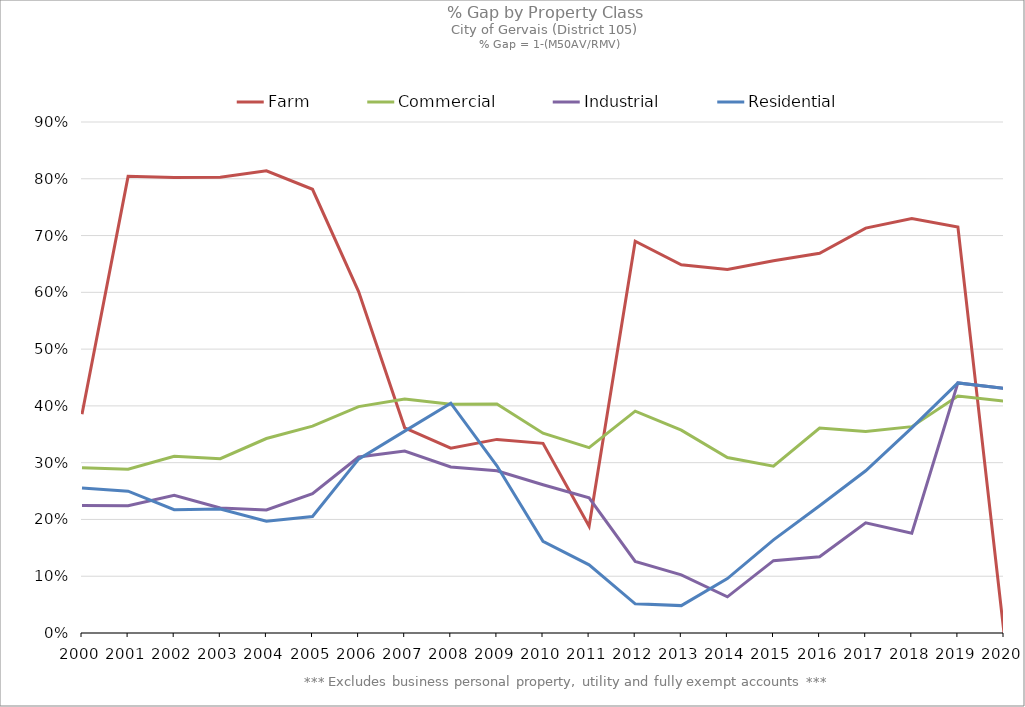
| Category | Farm | Commercial | Industrial | Residential |
|---|---|---|---|---|
| 2000.0 | 0.385 | 0.291 | 0.225 | 0.255 |
| 2001.0 | 0.804 | 0.288 | 0.224 | 0.25 |
| 2002.0 | 0.802 | 0.311 | 0.243 | 0.217 |
| 2003.0 | 0.802 | 0.307 | 0.22 | 0.218 |
| 2004.0 | 0.814 | 0.343 | 0.217 | 0.197 |
| 2005.0 | 0.781 | 0.364 | 0.245 | 0.205 |
| 2006.0 | 0.601 | 0.399 | 0.31 | 0.306 |
| 2007.0 | 0.361 | 0.412 | 0.321 | 0.356 |
| 2008.0 | 0.326 | 0.403 | 0.292 | 0.405 |
| 2009.0 | 0.341 | 0.403 | 0.286 | 0.294 |
| 2010.0 | 0.334 | 0.352 | 0.261 | 0.161 |
| 2011.0 | 0.188 | 0.326 | 0.238 | 0.12 |
| 2012.0 | 0.69 | 0.391 | 0.126 | 0.051 |
| 2013.0 | 0.648 | 0.357 | 0.102 | 0.048 |
| 2014.0 | 0.64 | 0.309 | 0.064 | 0.096 |
| 2015.0 | 0.656 | 0.294 | 0.127 | 0.164 |
| 2016.0 | 0.669 | 0.361 | 0.134 | 0.224 |
| 2017.0 | 0.713 | 0.355 | 0.194 | 0.286 |
| 2018.0 | 0.73 | 0.363 | 0.176 | 0.361 |
| 2019.0 | 0.715 | 0.417 | 0.44 | 0.44 |
| 2020.0 | 0 | 0.408 | 0.431 | 0.431 |